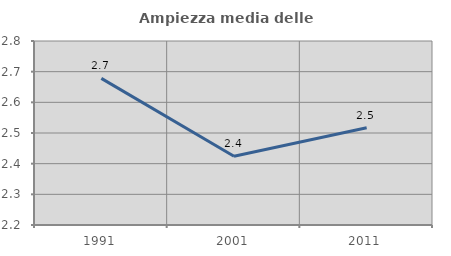
| Category | Ampiezza media delle famiglie |
|---|---|
| 1991.0 | 2.678 |
| 2001.0 | 2.424 |
| 2011.0 | 2.517 |